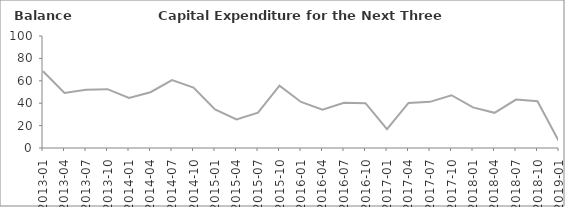
| Category | Balance |
|---|---|
| 2013-01 | 68.5 |
| 2013-04 | 49.1 |
| 2013-07 | 51.9 |
| 2013-10 | 52.5 |
| 2014-01 | 44.6 |
| 2014-04 | 49.8 |
| 2014-07 | 60.6 |
| 2014-10 | 53.9 |
| 2015-01 | 34.5 |
| 2015-04 | 25.5 |
| 2015-07 | 31.5 |
| 2015-10 | 55.7 |
| 2016-01 | 41.1 |
| 2016-04 | 34.2 |
| 2016-07 | 40.4 |
| 2016-10 | 40 |
| 2017-01 | 16.9 |
| 2017-04 | 40.2 |
| 2017-07 | 41.2 |
| 2017-10 | 47.1 |
| 2018-01 | 36.3 |
| 2018-04 | 31.4 |
| 2018-07 | 43.2 |
| 2018-10 | 41.8 |
| 2019-01 | 5.8 |